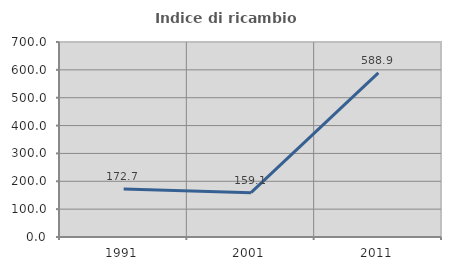
| Category | Indice di ricambio occupazionale  |
|---|---|
| 1991.0 | 172.727 |
| 2001.0 | 159.091 |
| 2011.0 | 588.889 |